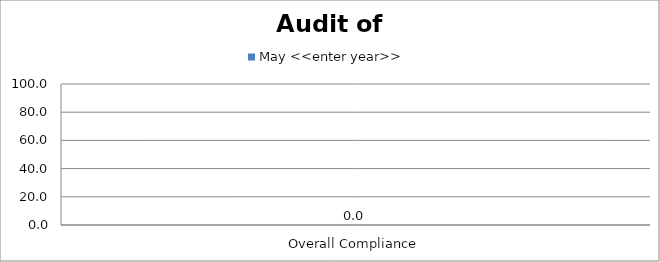
| Category | May <<enter year>> |
|---|---|
| Overall Compliance | 0 |